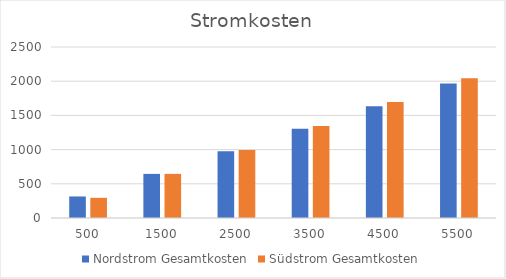
| Category | Nordstrom | Südstrom |
|---|---|---|
| 500.0 | 315 | 294.88 |
| 1500.0 | 645 | 644.88 |
| 2500.0 | 975 | 994.88 |
| 3500.0 | 1305 | 1344.88 |
| 4500.0 | 1635 | 1694.88 |
| 5500.0 | 1965 | 2044.88 |